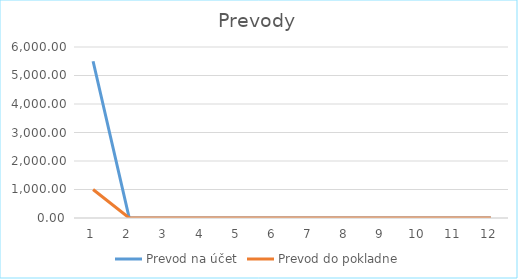
| Category | Prevod na účet | Prevod do pokladne |
|---|---|---|
| 0 | 5500 | 1000 |
| 1 | 0 | 0 |
| 2 | 0 | 0 |
| 3 | 0 | 0 |
| 4 | 0 | 0 |
| 5 | 0 | 0 |
| 6 | 0 | 0 |
| 7 | 0 | 0 |
| 8 | 0 | 0 |
| 9 | 0 | 0 |
| 10 | 0 | 0 |
| 11 | 0 | 0 |